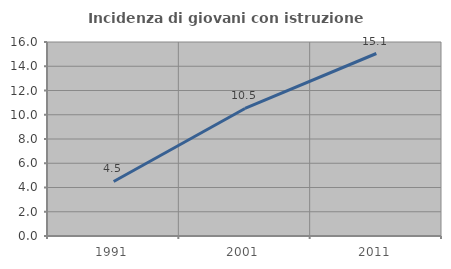
| Category | Incidenza di giovani con istruzione universitaria |
|---|---|
| 1991.0 | 4.496 |
| 2001.0 | 10.517 |
| 2011.0 | 15.051 |